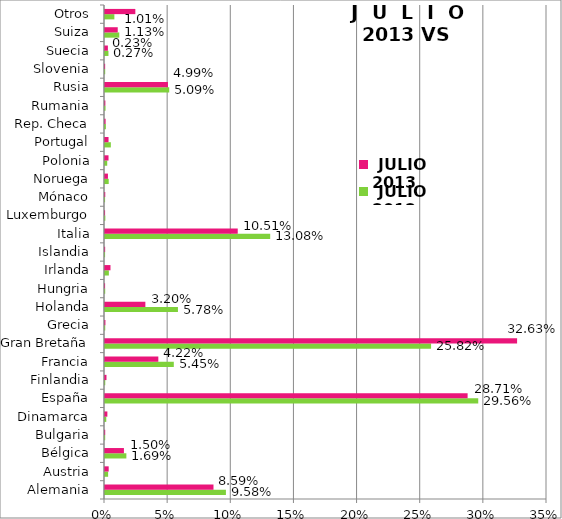
| Category |  JULIO  2012 |  JULIO  2013 |
|---|---|---|
| Alemania | 0.096 | 0.086 |
| Austria | 0.002 | 0.003 |
| Bélgica | 0.017 | 0.015 |
| Bulgaria | 0 | 0 |
| Dinamarca | 0.001 | 0.002 |
| España | 0.296 | 0.287 |
| Finlandia | 0 | 0.001 |
| Francia | 0.054 | 0.042 |
| Gran Bretaña | 0.258 | 0.326 |
| Grecia | 0 | 0 |
| Holanda | 0.058 | 0.032 |
| Hungria | 0 | 0 |
| Irlanda | 0.003 | 0.004 |
| Islandia | 0 | 0 |
| Italia | 0.131 | 0.105 |
| Luxemburgo | 0 | 0 |
| Mónaco | 0 | 0 |
| Noruega | 0.003 | 0.002 |
| Polonia | 0.002 | 0.003 |
| Portugal | 0.005 | 0.003 |
| Rep. Checa | 0.001 | 0 |
| Rumania | 0 | 0 |
| Rusia | 0.051 | 0.05 |
| Slovenia | 0 | 0 |
| Suecia | 0.003 | 0.002 |
| Suiza | 0.011 | 0.01 |
| Otros | 0.007 | 0.024 |